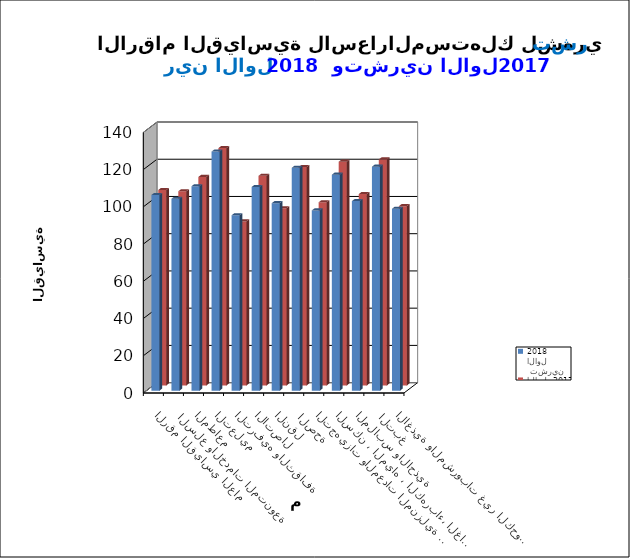
| Category |  تشرين الاول     2018      | تشرين الاول  2017 |
|---|---|---|
| الاغذية والمشروبات غير الكحولية | 97.7 | 96.3 |
|  التبغ | 120.3 | 121.4 |
| الملابس والاحذية | 101.8 | 102.8 |
| السكن ، المياه ، الكهرباء، الغاز  | 116 | 120.2 |
| التجهيزات والمعدات المنزلية والصيانة | 96.8 | 98.4 |
|  الصحة | 119.7 | 117.3 |
| النقل | 100.7 | 95.2 |
| الاتصال | 109.4 | 112.6 |
| الترفيه والثقافة | 94.2 | 88.1 |
| التعليم | 128.4 | 127.5 |
| المطاعم  | 109.8 | 112 |
|  السلع والخدمات المتنوعة | 103.1 | 104.3 |
| الرقم القياسي العام | 105.1 | 105 |